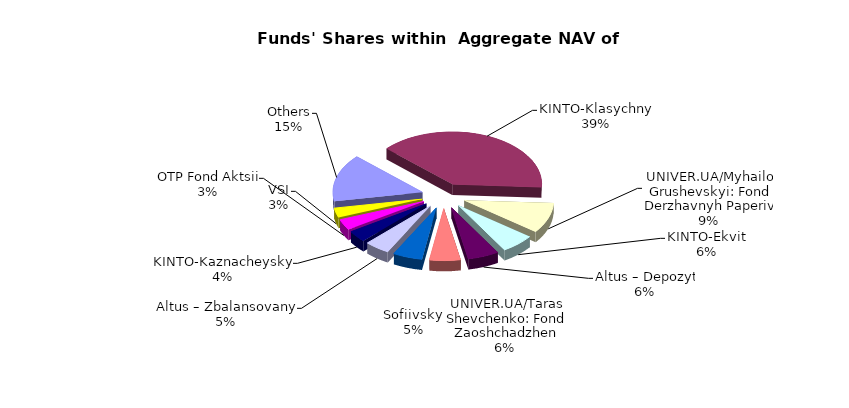
| Category | Series 0 | Series 1 |
|---|---|---|
| Others | 7984640.991 | 0.147 |
| KINTO-Klasychnyi | 21212925.393 | 0.39 |
| UNIVER.UA/Myhailo Grushevskyi: Fond Derzhavnyh Paperiv | 5117381.63 | 0.094 |
| KINTO-Ekviti | 3296270.08 | 0.061 |
| Altus – Depozyt | 3058409.95 | 0.056 |
| UNIVER.UA/Taras Shevchenko: Fond Zaoshchadzhen | 3048310.88 | 0.056 |
| Sofiivskyi | 2892980.138 | 0.053 |
| Altus – Zbalansovanyi | 2473900.01 | 0.045 |
| KINTO-Kaznacheyskyi | 1925363.93 | 0.035 |
| OTP Fond Aktsii | 1795919.53 | 0.033 |
| VSI | 1599359.69 | 0.029 |